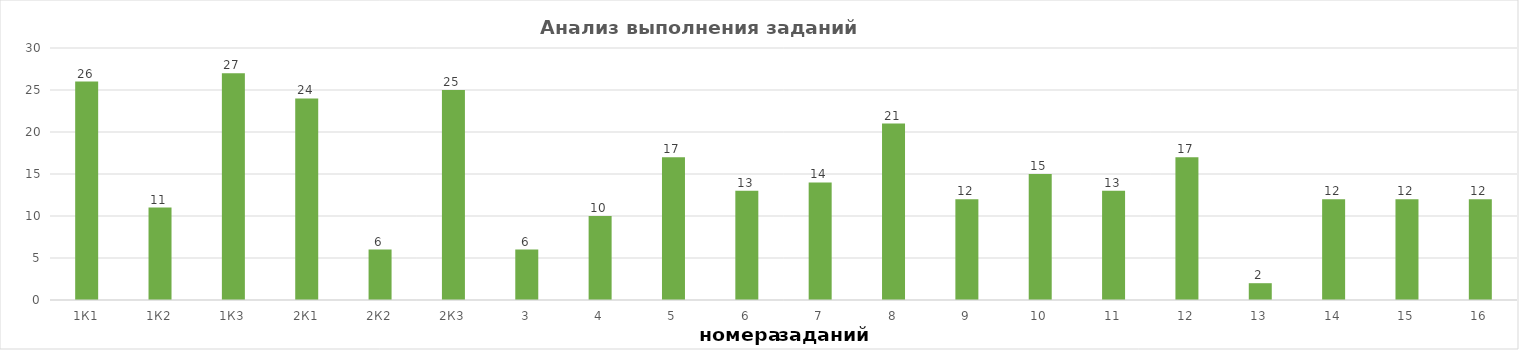
| Category | задания |
|---|---|
| 1К1 | 26 |
| 1К2 | 11 |
| 1К3 | 27 |
| 2К1 | 24 |
| 2К2 | 6 |
| 2К3 | 25 |
| 3 | 6 |
| 4 | 10 |
| 5 | 17 |
| 6 | 13 |
| 7 | 14 |
| 8 | 21 |
| 9 | 12 |
| 10 | 15 |
| 11 | 13 |
| 12 | 17 |
| 13 | 2 |
| 14 | 12 |
| 15 | 12 |
| 16 | 12 |